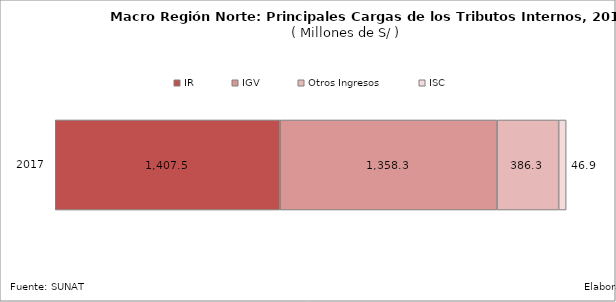
| Category | IR | IGV | Otros Ingresos | ISC |
|---|---|---|---|---|
| 2017.0 | 1407.47 | 1358.339 | 386.3 | 46.852 |